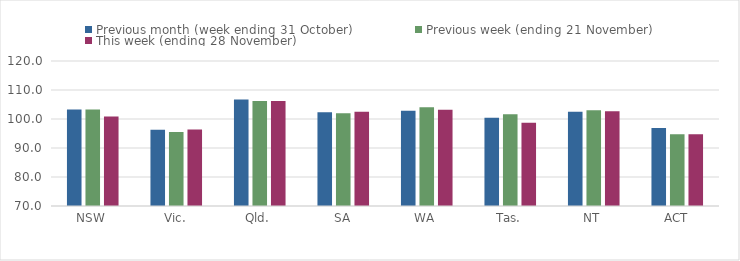
| Category | Previous month (week ending 31 October) | Previous week (ending 21 November) | This week (ending 28 November) |
|---|---|---|---|
| NSW | 103.27 | 103.25 | 100.86 |
| Vic. | 96.33 | 95.51 | 96.36 |
| Qld. | 106.76 | 106.19 | 106.19 |
| SA | 102.3 | 101.99 | 102.51 |
| WA | 102.81 | 104.08 | 103.22 |
| Tas. | 100.4 | 101.66 | 98.68 |
| NT | 102.52 | 103.05 | 102.64 |
| ACT | 96.91 | 94.75 | 94.75 |